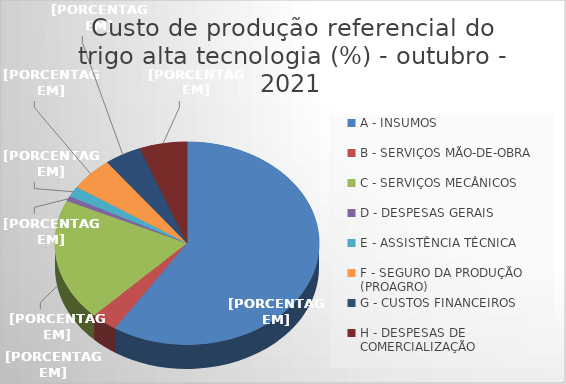
| Category | Series 0 |
|---|---|
| A - INSUMOS | 59.17 |
| B - SERVIÇOS MÃO-DE-OBRA | 3.217 |
| C - SERVIÇOS MECÂNICOS | 19.448 |
| D - DESPESAS GERAIS  | 0.818 |
| E - ASSISTÊNCIA TÉCNICA | 1.653 |
| F - SEGURO DA PRODUÇÃO (PROAGRO) | 5.372 |
| G - CUSTOS FINANCEIROS | 4.484 |
| H - DESPESAS DE COMERCIALIZAÇÃO | 5.837 |